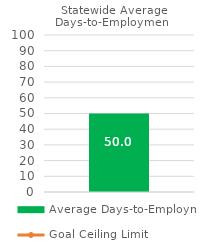
| Category | Average Days-to-Employment |
|---|---|
| 0 | 49.961 |